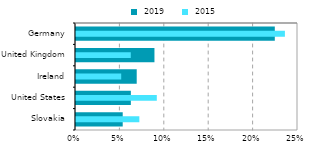
| Category |  2019 |
|---|---|
| Slovakia | 0.053 |
| United States | 0.062 |
| Ireland | 0.068 |
| United Kingdom | 0.088 |
| Germany | 0.224 |